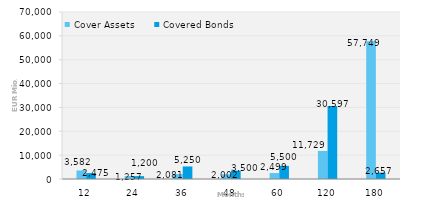
| Category | Cover Assets | Covered Bonds |
|---|---|---|
| 12.0 | 3582.24 | 2475 |
| 24.0 | 1257.3 | 1200 |
| 36.0 | 2080.82 | 5250 |
| 48.0 | 2001.77 | 3500 |
| 60.0 | 2499.07 | 5500 |
| 120.0 | 11728.59 | 30597.2 |
| 180.0 | 57748.72 | 2657 |